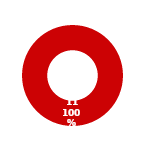
| Category | SITUATION |
|---|---|
| MIL 2 Complete | 0 |
| MIL 2 Not Complete | 11 |